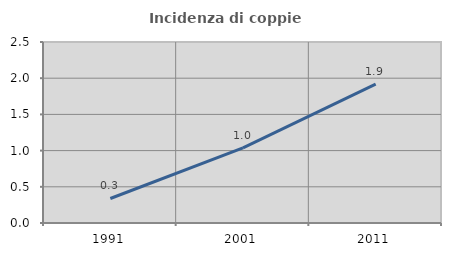
| Category | Incidenza di coppie miste |
|---|---|
| 1991.0 | 0.339 |
| 2001.0 | 1.037 |
| 2011.0 | 1.917 |